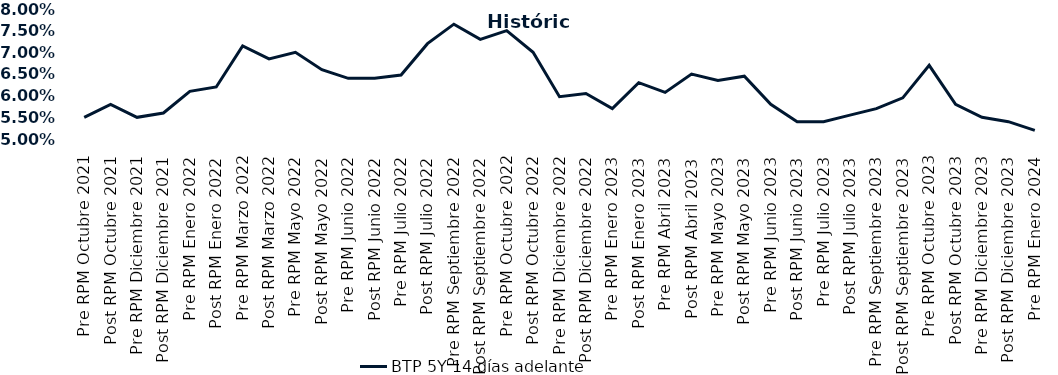
| Category | BTP 5Y 14 días adelante |
|---|---|
| Pre RPM Octubre 2021 | 0.055 |
| Post RPM Octubre 2021 | 0.058 |
| Pre RPM Diciembre 2021 | 0.055 |
| Post RPM Diciembre 2021 | 0.056 |
| Pre RPM Enero 2022 | 0.061 |
| Post RPM Enero 2022 | 0.062 |
| Pre RPM Marzo 2022 | 0.072 |
| Post RPM Marzo 2022 | 0.068 |
| Pre RPM Mayo 2022 | 0.07 |
| Post RPM Mayo 2022 | 0.066 |
| Pre RPM Junio 2022 | 0.064 |
| Post RPM Junio 2022 | 0.064 |
| Pre RPM Julio 2022 | 0.065 |
| Post RPM Julio 2022 | 0.072 |
| Pre RPM Septiembre 2022 | 0.076 |
| Post RPM Septiembre 2022 | 0.073 |
| Pre RPM Octubre 2022 | 0.075 |
| Post RPM Octubre 2022 | 0.07 |
| Pre RPM Diciembre 2022 | 0.06 |
| Post RPM Diciembre 2022 | 0.06 |
| Pre RPM Enero 2023 | 0.057 |
| Post RPM Enero 2023 | 0.063 |
| Pre RPM Abril 2023 | 0.061 |
| Post RPM Abril 2023 | 0.065 |
| Pre RPM Mayo 2023 | 0.064 |
| Post RPM Mayo 2023 | 0.064 |
| Pre RPM Junio 2023 | 0.058 |
| Post RPM Junio 2023 | 0.054 |
| Pre RPM Julio 2023 | 0.054 |
| Post RPM Julio 2023 | 0.056 |
| Pre RPM Septiembre 2023 | 0.057 |
| Post RPM Septiembre 2023 | 0.06 |
| Pre RPM Octubre 2023 | 0.067 |
| Post RPM Octubre 2023 | 0.058 |
| Pre RPM Diciembre 2023 | 0.055 |
| Post RPM Diciembre 2023 | 0.054 |
| Pre RPM Enero 2024 | 0.052 |